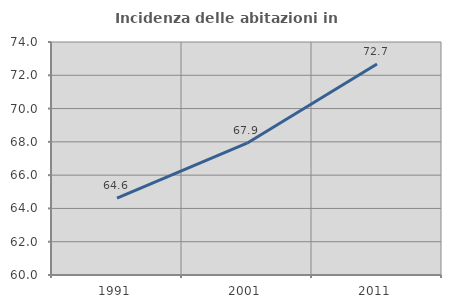
| Category | Incidenza delle abitazioni in proprietà  |
|---|---|
| 1991.0 | 64.624 |
| 2001.0 | 67.919 |
| 2011.0 | 72.678 |